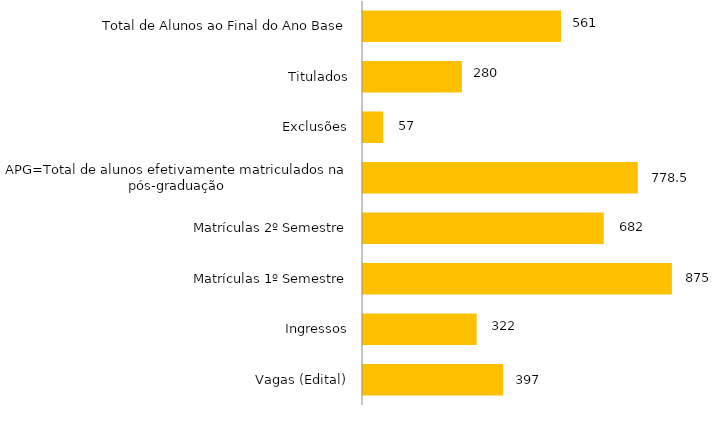
| Category | Curso |
|---|---|
| Vagas (Edital) | 397 |
| Ingressos | 322 |
| Matrículas 1º Semestre | 875 |
| Matrículas 2º Semestre | 682 |
| APG=Total de alunos efetivamente matriculados na pós-graduação | 778.5 |
| Exclusões | 57 |
| Titulados | 280 |
| Total de Alunos ao Final do Ano Base | 561 |